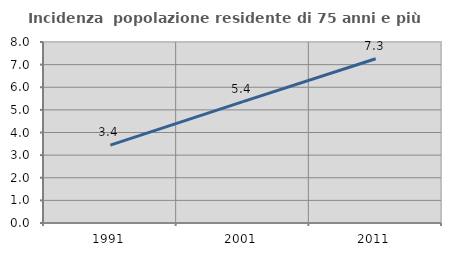
| Category | Incidenza  popolazione residente di 75 anni e più |
|---|---|
| 1991.0 | 3.442 |
| 2001.0 | 5.365 |
| 2011.0 | 7.261 |